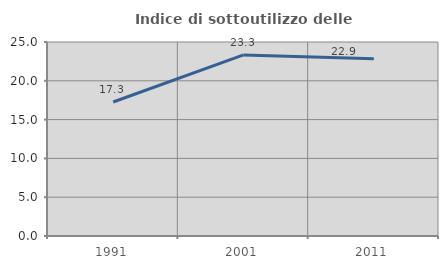
| Category | Indice di sottoutilizzo delle abitazioni  |
|---|---|
| 1991.0 | 17.265 |
| 2001.0 | 23.331 |
| 2011.0 | 22.855 |